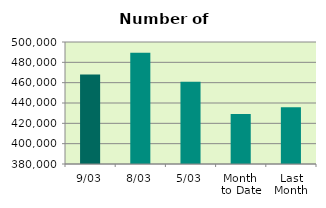
| Category | Series 0 |
|---|---|
| 9/03 | 468080 |
| 8/03 | 489344 |
| 5/03 | 460848 |
| Month 
to Date | 429293.143 |
| Last
Month | 435925.8 |